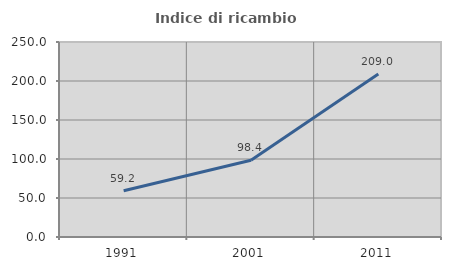
| Category | Indice di ricambio occupazionale  |
|---|---|
| 1991.0 | 59.228 |
| 2001.0 | 98.397 |
| 2011.0 | 209.02 |